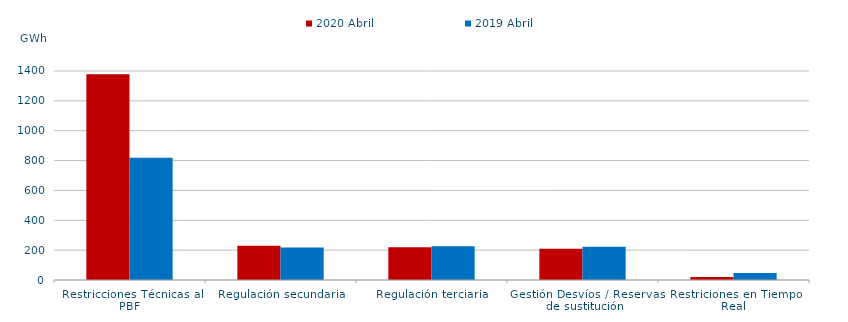
| Category | 2020 Abril | 2019 Abril |
|---|---|---|
| Restricciones Técnicas al PBF | 1378.435 | 818.212 |
| Regulación secundaria | 230.238 | 218.321 |
| Regulación terciaria | 219.665 | 226.326 |
| Gestión Desvíos / Reservas de sustitución | 209.511 | 222.86 |
| Restriciones en Tiempo Real | 20.785 | 47.017 |